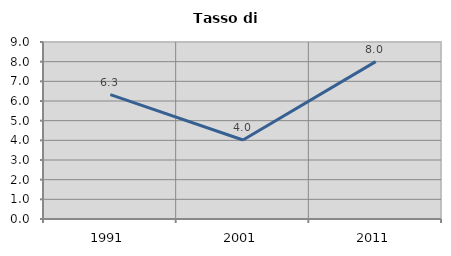
| Category | Tasso di disoccupazione   |
|---|---|
| 1991.0 | 6.322 |
| 2001.0 | 4.017 |
| 2011.0 | 8 |